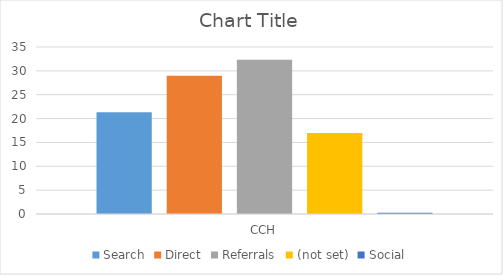
| Category | Search | Direct | Referrals | (not set) | Social |
|---|---|---|---|---|---|
| CCH | 21.31 | 28.99 | 32.34 | 17 | 0.27 |